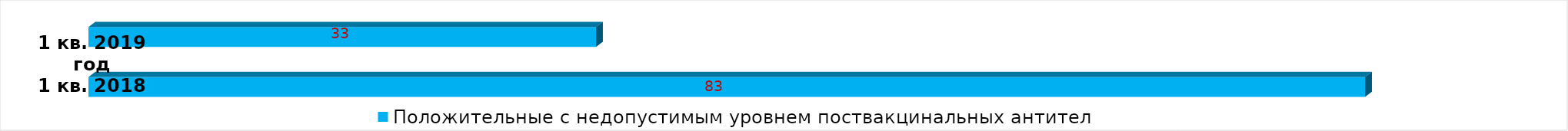
| Category | Положительные с недопустимым уровнем поствакцинальных антител |
|---|---|
| Положительные с недопустимым уровнем поствакцинальных антител | 83 |